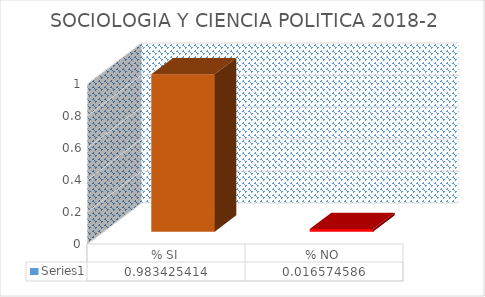
| Category | Series 0 |
|---|---|
| % SI | 0.983 |
| % NO | 0.017 |